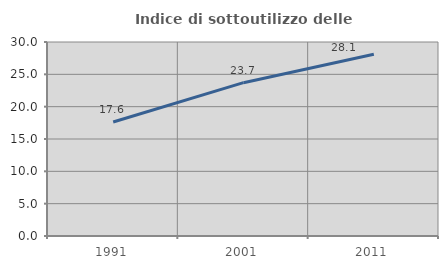
| Category | Indice di sottoutilizzo delle abitazioni  |
|---|---|
| 1991.0 | 17.629 |
| 2001.0 | 23.711 |
| 2011.0 | 28.114 |